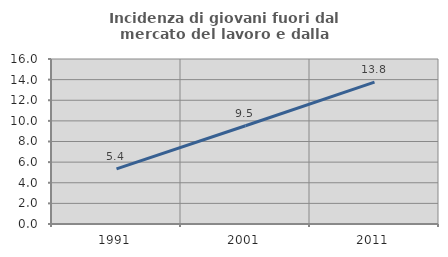
| Category | Incidenza di giovani fuori dal mercato del lavoro e dalla formazione  |
|---|---|
| 1991.0 | 5.352 |
| 2001.0 | 9.524 |
| 2011.0 | 13.757 |